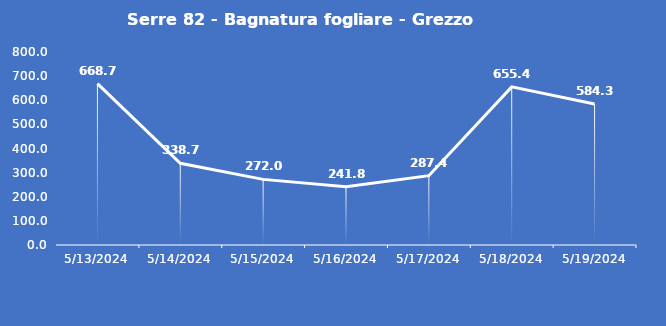
| Category | Serre 82 - Bagnatura fogliare - Grezzo (min) |
|---|---|
| 5/13/24 | 668.7 |
| 5/14/24 | 338.7 |
| 5/15/24 | 272 |
| 5/16/24 | 241.8 |
| 5/17/24 | 287.4 |
| 5/18/24 | 655.4 |
| 5/19/24 | 584.3 |